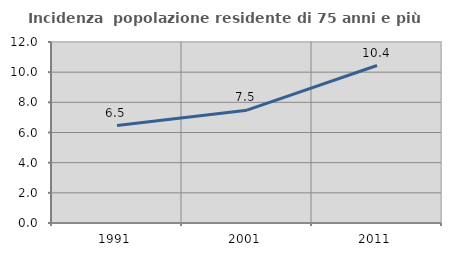
| Category | Incidenza  popolazione residente di 75 anni e più |
|---|---|
| 1991.0 | 6.459 |
| 2001.0 | 7.48 |
| 2011.0 | 10.44 |